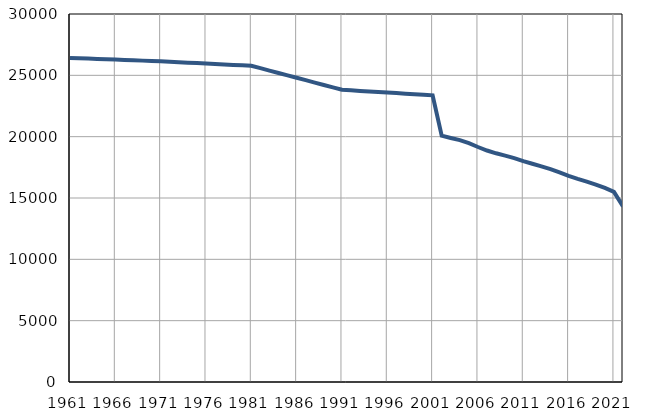
| Category | Број
становника |
|---|---|
| 1961.0 | 26423 |
| 1962.0 | 26395 |
| 1963.0 | 26367 |
| 1964.0 | 26339 |
| 1965.0 | 26311 |
| 1966.0 | 26283 |
| 1967.0 | 26255 |
| 1968.0 | 26227 |
| 1969.0 | 26199 |
| 1970.0 | 26171 |
| 1971.0 | 26143 |
| 1972.0 | 26107 |
| 1973.0 | 26070 |
| 1974.0 | 26034 |
| 1975.0 | 25998 |
| 1976.0 | 25961 |
| 1977.0 | 25925 |
| 1978.0 | 25888 |
| 1979.0 | 25852 |
| 1980.0 | 25815 |
| 1981.0 | 25779 |
| 1982.0 | 25583 |
| 1983.0 | 25387 |
| 1984.0 | 25192 |
| 1985.0 | 24996 |
| 1986.0 | 24800 |
| 1987.0 | 24604 |
| 1988.0 | 24408 |
| 1989.0 | 24213 |
| 1990.0 | 24017 |
| 1991.0 | 23821 |
| 1992.0 | 23776 |
| 1993.0 | 23731 |
| 1994.0 | 23686 |
| 1995.0 | 23641 |
| 1996.0 | 23596 |
| 1997.0 | 23551 |
| 1998.0 | 23506 |
| 1999.0 | 23461 |
| 2000.0 | 23416 |
| 2001.0 | 23371 |
| 2002.0 | 20086 |
| 2003.0 | 19895 |
| 2004.0 | 19719 |
| 2005.0 | 19469 |
| 2006.0 | 19157 |
| 2007.0 | 18871 |
| 2008.0 | 18645 |
| 2009.0 | 18455 |
| 2010.0 | 18254 |
| 2011.0 | 18002 |
| 2012.0 | 17790 |
| 2013.0 | 17582 |
| 2014.0 | 17349 |
| 2015.0 | 17086 |
| 2016.0 | 16803 |
| 2017.0 | 16561 |
| 2018.0 | 16340 |
| 2019.0 | 16099 |
| 2020.0 | 15820 |
| 2021.0 | 15495 |
| 2022.0 | 14314 |